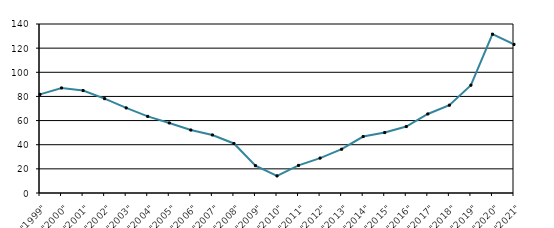
| Category | Series 1 |
|---|---|
| "1999" | 81.693 |
| "2000" | 87.026 |
| "2001" | 84.841 |
| "2002" | 78.14 |
| "2003" | 70.488 |
| "2004" | 63.486 |
| "2005" | 58.019 |
| "2006" | 52.153 |
| "2007" | 48.074 |
| "2008" | 41.026 |
| "2009" | 22.636 |
| "2010" | 14.148 |
| "2011" | 22.867 |
| "2012" | 28.927 |
| "2013" | 36.282 |
| "2014" | 46.751 |
| "2015" | 50.05 |
| "2016" | 55.027 |
| "2017" | 65.482 |
| "2018" | 72.756 |
| "2019" | 89.339 |
| "2020" | 131.572 |
| "2021" | 123.117 |